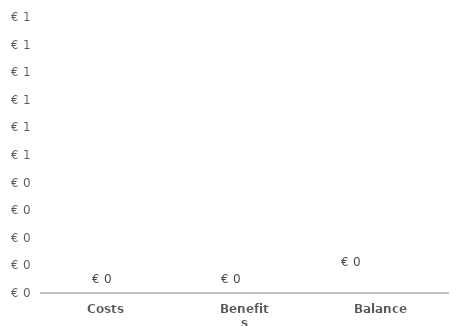
| Category | Series 0 |
|---|---|
| Costs | 0 |
| Benefits | 0 |
| Balance | 0 |